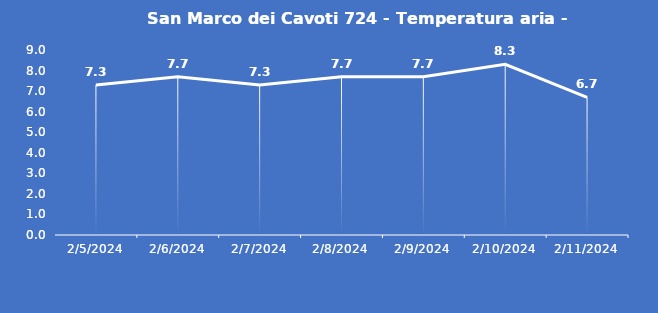
| Category | San Marco dei Cavoti 724 - Temperatura aria - Grezzo (°C) |
|---|---|
| 2/5/24 | 7.3 |
| 2/6/24 | 7.7 |
| 2/7/24 | 7.3 |
| 2/8/24 | 7.7 |
| 2/9/24 | 7.7 |
| 2/10/24 | 8.3 |
| 2/11/24 | 6.7 |